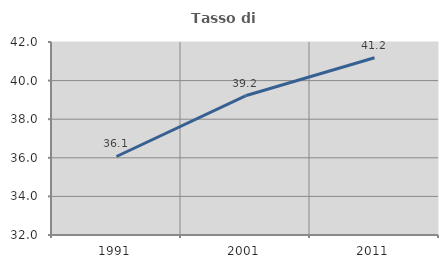
| Category | Tasso di occupazione   |
|---|---|
| 1991.0 | 36.068 |
| 2001.0 | 39.212 |
| 2011.0 | 41.186 |